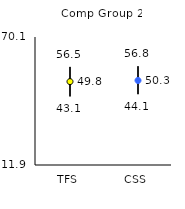
| Category | 25th | 75th | Mean |
|---|---|---|---|
| TFS | 43.1 | 56.5 | 49.82 |
| CSS | 44.1 | 56.8 | 50.33 |